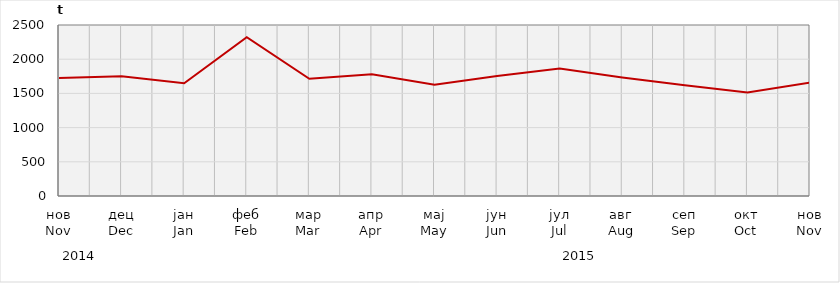
| Category | Нето тежина заклане стоке                              Net weight of  slaughtered livestock |
|---|---|
| нов
Nov | 1726709.59 |
| дец
Dec | 1751098 |
| јан
Jan | 1649074.16 |
| феб
Feb | 2321007.9 |
| мар
Mar | 1714725.6 |
| апр
Apr | 1780678.65 |
| мај
May | 1628212.69 |
| јун
Jun | 1753845.16 |
| јул
Jul | 1862492.5 |
| авг
Aug | 1733294.8 |
| сеп
Sep | 1619599 |
| окт
Oct | 1511667.7 |
| нов
Nov | 1658700 |